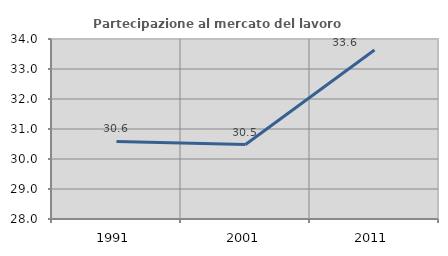
| Category | Partecipazione al mercato del lavoro  femminile |
|---|---|
| 1991.0 | 30.587 |
| 2001.0 | 30.481 |
| 2011.0 | 33.634 |